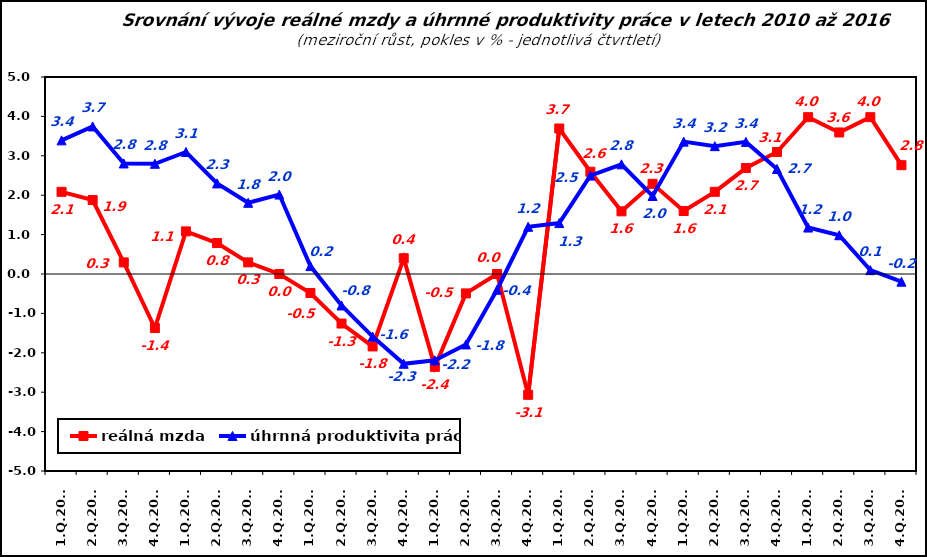
| Category | reálná mzda | úhrnná produktivita práce |
|---|---|---|
| 1.Q.2010 | 2.085 | 3.392 |
| 2.Q.2010 | 1.877 | 3.745 |
| 3.Q.2010 | 0.294 | 2.806 |
| 4.Q.2010 | -1.371 | 2.797 |
| 1.Q.2011 | 1.082 | 3.097 |
| 2.Q.2011 | 0.786 | 2.3 |
| 3.Q.2011 | 0.295 | 1.807 |
| 4.Q.2011 | 0 | 2.016 |
| 1.Q.2012 | -0.482 | 0.2 |
| 2.Q.2012 | -1.257 | -0.798 |
| 3.Q.2012 | -1.839 | -1.589 |
| 4.Q.2012 | 0.4 | -2.279 |
| 1.Q.2013 | -2.358 | -2.191 |
| 2.Q.2013 | -0.493 | -1.787 |
| 3.Q.2013 | 0 | -0.4 |
| 4.Q.2013 | -3.066 | 1.199 |
| 1.Q.2014 | 3.693 | 1.292 |
| 2.Q.2014 | 2.595 | 2.498 |
| 3.Q.2014 | 1.59 | 2.783 |
| 4.Q.2014 | 2.289 | 1.98 |
| 1.Q.2015 | 1.598 | 3.36 |
| 2.Q.2015 | 2.085 | 3.245 |
| 3.Q.2015 | 2.689 | 3.353 |
| 4.Q.2015 | 3.097 | 2.665 |
| 1.Q.2016 | 3.98 | 1.179 |
| 2.Q.2016 | 3.593 | 0.984 |
| 3.Q.2016 | 3.98 | 0.098 |
| 4.Q.2016 | 2.761 | -0.196 |